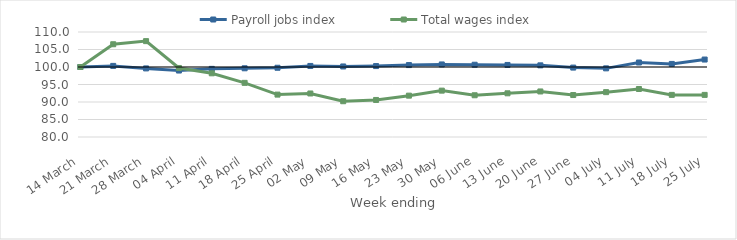
| Category | Payroll jobs index | Total wages index |
|---|---|---|
| 2020-03-14 | 100 | 100 |
| 2020-03-21 | 100.316 | 106.501 |
| 2020-03-28 | 99.598 | 107.392 |
| 2020-04-04 | 98.991 | 99.719 |
| 2020-04-11 | 99.469 | 98.196 |
| 2020-04-18 | 99.63 | 95.471 |
| 2020-04-25 | 99.782 | 92.113 |
| 2020-05-02 | 100.3 | 92.436 |
| 2020-05-09 | 100.153 | 90.219 |
| 2020-05-16 | 100.266 | 90.581 |
| 2020-05-23 | 100.55 | 91.814 |
| 2020-05-30 | 100.73 | 93.248 |
| 2020-06-06 | 100.646 | 91.927 |
| 2020-06-13 | 100.586 | 92.483 |
| 2020-06-20 | 100.471 | 93.009 |
| 2020-06-27 | 99.834 | 91.989 |
| 2020-07-04 | 99.613 | 92.817 |
| 2020-07-11 | 101.285 | 93.715 |
| 2020-07-18 | 100.876 | 92.034 |
| 2020-07-25 | 102.131 | 92.032 |